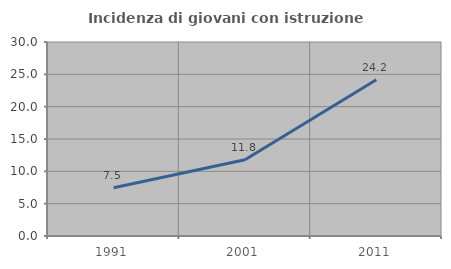
| Category | Incidenza di giovani con istruzione universitaria |
|---|---|
| 1991.0 | 7.475 |
| 2001.0 | 11.802 |
| 2011.0 | 24.177 |